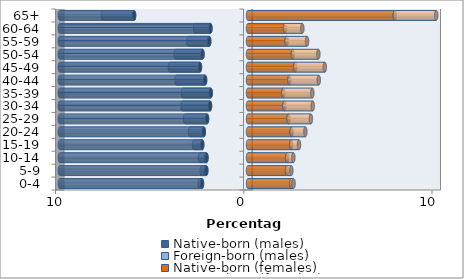
| Category | Native-born (males) | Foreign-born (males) | Native-born (females) | Foreign-born (females) |
|---|---|---|---|---|
| 0-4 | -2.443 | -0.128 | 2.299 | 0.122 |
| 5-9 | -2.215 | -0.244 | 2.071 | 0.231 |
| 10-14 | -2.207 | -0.35 | 2.08 | 0.328 |
| 15-19 | -2.43 | -0.437 | 2.293 | 0.417 |
| 20-24 | -2.346 | -0.738 | 2.32 | 0.73 |
| 25-29 | -2.174 | -1.167 | 2.155 | 1.188 |
| 30-34 | -2.016 | -1.458 | 1.934 | 1.506 |
| 35-39 | -1.977 | -1.477 | 1.875 | 1.542 |
| 40-44 | -2.278 | -1.52 | 2.2 | 1.559 |
| 45-49 | -2.551 | -1.6 | 2.512 | 1.569 |
| 50-54 | -2.417 | -1.426 | 2.381 | 1.359 |
| 55-59 | -2.06 | -1.115 | 2.05 | 1.088 |
| 60-64 | -1.995 | -0.82 | 1.965 | 0.923 |
| 65+ | -6.052 | -1.665 | 7.798 | 2.2 |